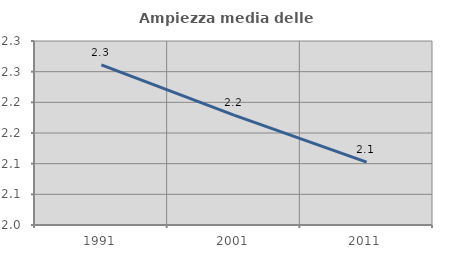
| Category | Ampiezza media delle famiglie |
|---|---|
| 1991.0 | 2.261 |
| 2001.0 | 2.179 |
| 2011.0 | 2.103 |